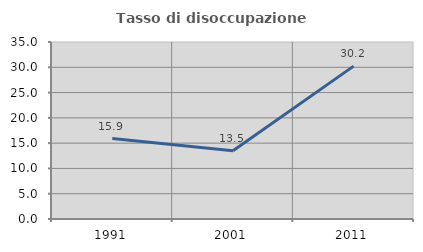
| Category | Tasso di disoccupazione giovanile  |
|---|---|
| 1991.0 | 15.909 |
| 2001.0 | 13.514 |
| 2011.0 | 30.233 |